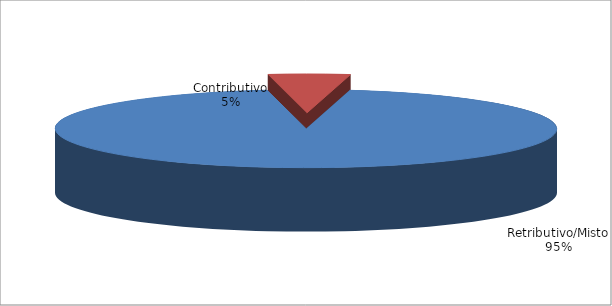
| Category | Series 1 |
|---|---|
| Retributivo/Misto | 65412 |
| Contributivo | 3632 |